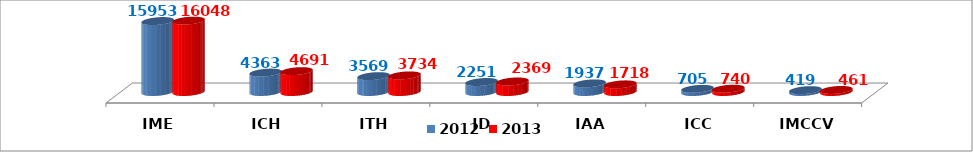
| Category | 2012 | 2013 |
|---|---|---|
| IME | 15952.9 | 16048 |
| ICH | 4363.271 | 4691.222 |
| ITH | 3568.5 | 3733.8 |
| ID | 2251.326 | 2369.341 |
| IAA | 1937.234 | 1717.505 |
| ICC | 704.7 | 739.6 |
| IMCCV | 418.698 | 461.239 |